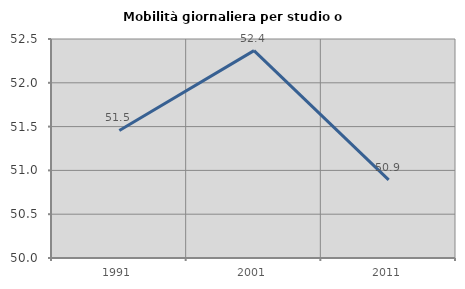
| Category | Mobilità giornaliera per studio o lavoro |
|---|---|
| 1991.0 | 51.456 |
| 2001.0 | 52.367 |
| 2011.0 | 50.891 |